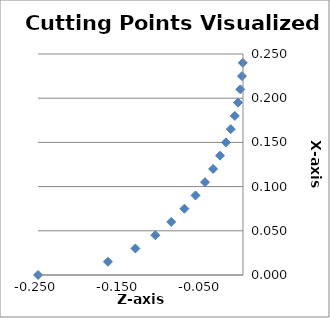
| Category | X-coordinate |
|---|---|
| -0.25 | 0 |
| -0.16470638945384009 | 0.015 |
| -0.13125657912962083 | 0.03 |
| -0.10690911978745818 | 0.045 |
| -0.08751923190728078 | 0.06 |
| -0.07146428928642876 | 0.075 |
| -0.057906272877014525 | 0.09 |
| -0.046345881455836985 | 0.105 |
| -0.03645843495937376 | 0.12 |
| -0.02802027119576886 | 0.135 |
| -0.020871215252207975 | 0.15 |
| -0.01489364108982505 | 0.165 |
| -0.009999999999999981 | 0.18 |
| -0.0061250320348560094 | 0.195 |
| -0.0032207464149386633 | 0.21 |
| -0.0012531407233450087 | 0.225 |
| -0.000200080064064051 | 0.24 |
| -5.0005001000247296e-05 | 0.255 |
| -0.0008012841124577508 | 0.27 |
| -0.0024621241102687486 | 0.285 |
| -0.0050510257216822285 | 0.3 |
| -0.008597845908533824 | 0.315 |
| -0.013145614353459845 | 0.33 |
| -0.01875337840305652 | 0.345 |
| -0.02550055679356361 | 0.36 |
| -0.03349364905389046 | 0.375 |